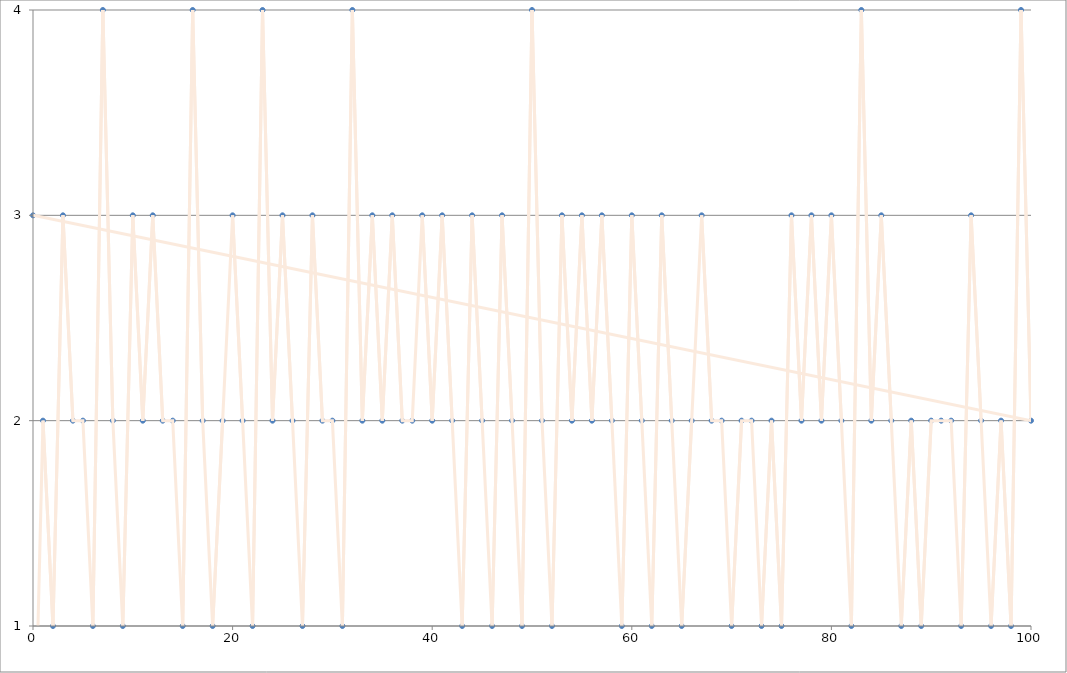
| Category | Series 0 |
|---|---|
| 0.0 | 0 |
| 1.0 | 2 |
| 2.0 | 1 |
| 3.0 | 3 |
| 4.0 | 2 |
| 5.0 | 2 |
| 6.0 | 1 |
| 7.0 | 4 |
| 8.0 | 2 |
| 9.0 | 1 |
| 10.0 | 3 |
| 11.0 | 2 |
| 12.0 | 3 |
| 13.0 | 2 |
| 14.0 | 2 |
| 15.0 | 1 |
| 16.0 | 4 |
| 17.0 | 2 |
| 18.0 | 1 |
| 19.0 | 2 |
| 20.0 | 3 |
| 21.0 | 2 |
| 22.0 | 1 |
| 23.0 | 4 |
| 24.0 | 2 |
| 25.0 | 3 |
| 26.0 | 2 |
| 27.0 | 1 |
| 28.0 | 3 |
| 29.0 | 2 |
| 30.0 | 2 |
| 31.0 | 1 |
| 32.0 | 4 |
| 33.0 | 2 |
| 34.0 | 3 |
| 35.0 | 2 |
| 36.0 | 3 |
| 37.0 | 2 |
| 38.0 | 2 |
| 39.0 | 3 |
| 40.0 | 2 |
| 41.0 | 3 |
| 42.0 | 2 |
| 43.0 | 1 |
| 44.0 | 3 |
| 45.0 | 2 |
| 46.0 | 1 |
| 47.0 | 3 |
| 48.0 | 2 |
| 49.0 | 1 |
| 50.0 | 4 |
| 51.0 | 2 |
| 52.0 | 1 |
| 53.0 | 3 |
| 54.0 | 2 |
| 55.0 | 3 |
| 56.0 | 2 |
| 57.0 | 3 |
| 58.0 | 2 |
| 59.0 | 1 |
| 60.0 | 3 |
| 61.0 | 2 |
| 62.0 | 1 |
| 63.0 | 3 |
| 64.0 | 2 |
| 65.0 | 1 |
| 66.0 | 2 |
| 67.0 | 3 |
| 68.0 | 2 |
| 69.0 | 2 |
| 70.0 | 1 |
| 71.0 | 2 |
| 72.0 | 2 |
| 73.0 | 1 |
| 74.0 | 2 |
| 75.0 | 1 |
| 76.0 | 3 |
| 77.0 | 2 |
| 78.0 | 3 |
| 79.0 | 2 |
| 80.0 | 3 |
| 81.0 | 2 |
| 82.0 | 1 |
| 83.0 | 4 |
| 84.0 | 2 |
| 85.0 | 3 |
| 86.0 | 2 |
| 87.0 | 1 |
| 88.0 | 2 |
| 89.0 | 1 |
| 90.0 | 2 |
| 91.0 | 2 |
| 92.0 | 2 |
| 93.0 | 1 |
| 94.0 | 3 |
| 95.0 | 2 |
| 96.0 | 1 |
| 97.0 | 2 |
| 98.0 | 1 |
| 99.0 | 4 |
| 100.0 | 2 |